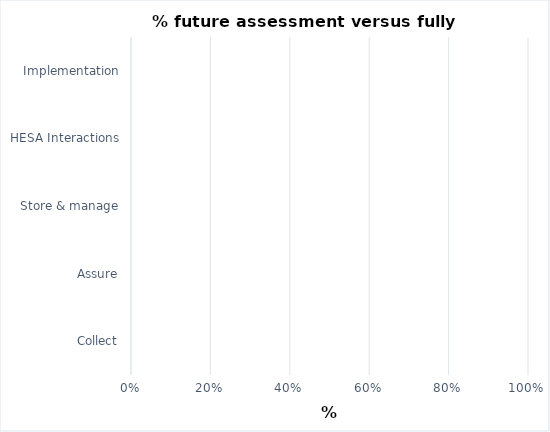
| Category | Series 0 |
|---|---|
| Collect | 0 |
| Assure | 0 |
| Store & manage | 0 |
| HESA Interactions | 0 |
| Implementation | 0 |